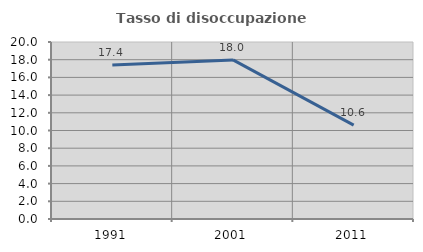
| Category | Tasso di disoccupazione giovanile  |
|---|---|
| 1991.0 | 17.391 |
| 2001.0 | 17.978 |
| 2011.0 | 10.606 |